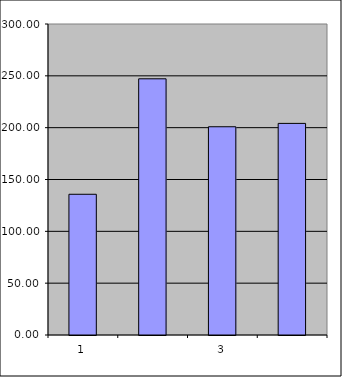
| Category | Series 0 |
|---|---|
| 0 | 135.75 |
| 1 | 247.127 |
| 2 | 200.874 |
| 3 | 204.125 |